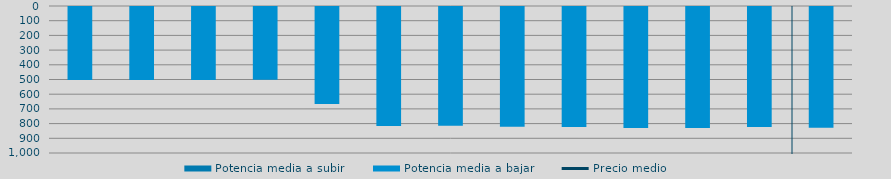
| Category | Potencia media a subir | Potencia media a bajar |
|---|---|---|
| 0 |  | 496 |
| 1 |  | 495.792 |
| 2 |  | 497.176 |
| 3 |  | 494.972 |
| 4 |  | 659.7 |
| 5 |  | 809.502 |
| 6 |  | 808.05 |
| 7 |  | 814.726 |
| 8 |  | 815.741 |
| 9 |  | 822.445 |
| 10 |  | 823.804 |
| 11 |  | 816.372 |
| 12 |  | 821.408 |